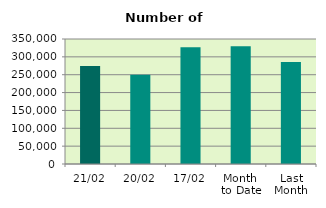
| Category | Series 0 |
|---|---|
| 21/02 | 274390 |
| 20/02 | 249992 |
| 17/02 | 327090 |
| Month 
to Date | 329765.467 |
| Last
Month | 285405.636 |